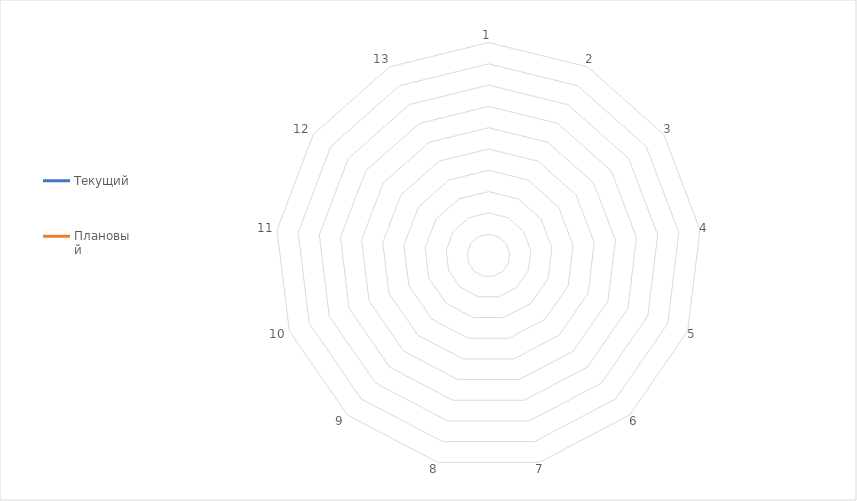
| Category | Текущий | Плановый |
|---|---|---|
| 1.0 | 0 | 0 |
| 2.0 | 0 | 0 |
| 3.0 | 0 | 0 |
| 4.0 | 0 | 0 |
| 5.0 | 0 | 0 |
| 6.0 | 0 | 0 |
| 7.0 | 0 | 0 |
| 8.0 | 0 | 0 |
| 9.0 | 0 | 0 |
| 10.0 | 0 | 0 |
| 11.0 | 0 | 0 |
| 12.0 | 0 | 0 |
| 13.0 | 0 | 0 |